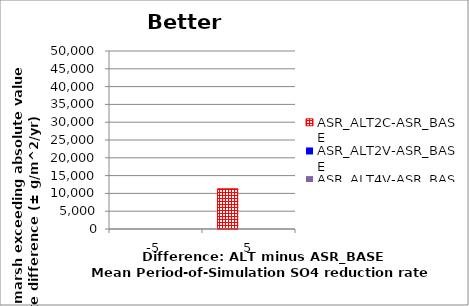
| Category | ASR_ALT2C-ASR_BASE | ASR_ALT2V-ASR_BASE | ASR_ALT4V-ASR_BASE |
|---|---|---|---|
| -5.0 | 0 | 0 | 0 |
| 5.0 | 11300 | 0 | 0 |